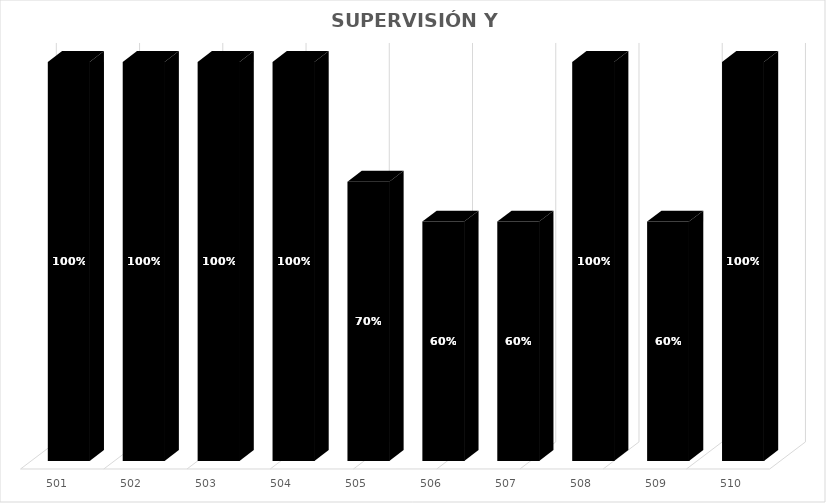
| Category | % Avance |
|---|---|
| 501.0 | 1 |
| 502.0 | 1 |
| 503.0 | 1 |
| 504.0 | 1 |
| 505.0 | 0.7 |
| 506.0 | 0.6 |
| 507.0 | 0.6 |
| 508.0 | 1 |
| 509.0 | 0.6 |
| 510.0 | 1 |